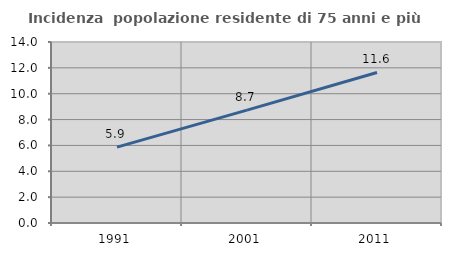
| Category | Incidenza  popolazione residente di 75 anni e più |
|---|---|
| 1991.0 | 5.868 |
| 2001.0 | 8.726 |
| 2011.0 | 11.643 |